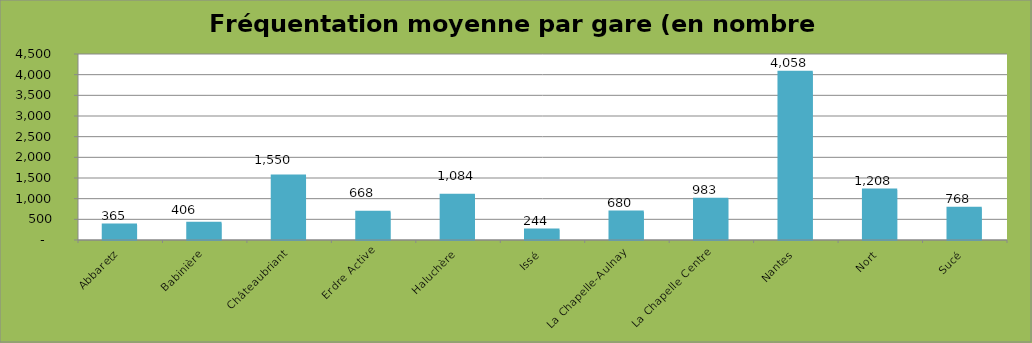
| Category | Moyenne (sans 0) |
|---|---|
| Abbaretz | 365.006 |
| Babinière | 405.728 |
| Châteaubriant | 1550.39 |
| Erdre Active | 668.497 |
| Haluchère | 1083.978 |
| Issé | 243.78 |
| La Chapelle-Aulnay | 679.988 |
| La Chapelle Centre | 982.959 |
| Nantes | 4058.343 |
| Nort | 1207.993 |
| Sucé | 767.864 |